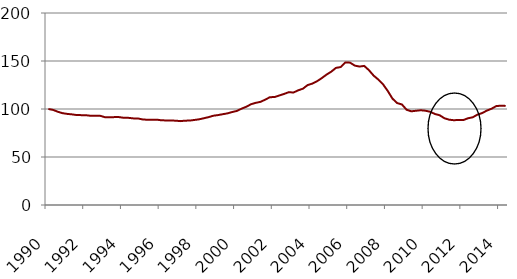
| Category | Housing Index Flow of Funds |
|---|---|
| 1990.0 | 100 |
| 1990.0 | 99.079 |
| 1990.0 | 97.135 |
| 1990.0 | 95.655 |
| 1991.0 | 94.904 |
| 1991.0 | 94.409 |
| 1991.0 | 93.71 |
| 1991.0 | 93.604 |
| 1992.0 | 93.492 |
| 1992.0 | 92.92 |
| 1992.0 | 92.848 |
| 1992.0 | 92.913 |
| 1993.0 | 91.468 |
| 1993.0 | 91.497 |
| 1993.0 | 91.539 |
| 1993.0 | 91.553 |
| 1994.0 | 90.851 |
| 1994.0 | 90.785 |
| 1994.0 | 90.23 |
| 1994.0 | 90.149 |
| 1995.0 | 89.131 |
| 1995.0 | 88.782 |
| 1995.0 | 88.79 |
| 1995.0 | 88.913 |
| 1996.0 | 88.205 |
| 1996.0 | 88.107 |
| 1996.0 | 87.953 |
| 1996.0 | 87.86 |
| 1997.0 | 87.368 |
| 1997.0 | 87.852 |
| 1997.0 | 87.946 |
| 1997.0 | 88.6 |
| 1998.0 | 89.267 |
| 1998.0 | 90.38 |
| 1998.0 | 91.549 |
| 1998.0 | 93.003 |
| 1999.0 | 93.666 |
| 1999.0 | 94.595 |
| 1999.0 | 95.448 |
| 1999.0 | 96.865 |
| 2000.0 | 98.004 |
| 2000.0 | 100.381 |
| 2000.0 | 102.35 |
| 2000.0 | 104.992 |
| 2001.0 | 106.434 |
| 2001.0 | 107.434 |
| 2001.0 | 109.754 |
| 2001.0 | 112.291 |
| 2002.0 | 112.478 |
| 2002.0 | 114.092 |
| 2002.0 | 115.686 |
| 2002.0 | 117.515 |
| 2003.0 | 117.176 |
| 2003.0 | 119.46 |
| 2003.0 | 121.152 |
| 2003.0 | 124.935 |
| 2004.0 | 126.469 |
| 2004.0 | 128.956 |
| 2004.0 | 132.178 |
| 2004.0 | 135.805 |
| 2005.0 | 138.861 |
| 2005.0 | 142.813 |
| 2005.0 | 143.685 |
| 2005.0 | 148.467 |
| 2006.0 | 148.284 |
| 2006.0 | 145.202 |
| 2006.0 | 144.214 |
| 2006.0 | 144.894 |
| 2007.0 | 140.44 |
| 2007.0 | 134.761 |
| 2007.0 | 130.645 |
| 2007.0 | 125.66 |
| 2008.0 | 118.729 |
| 2008.0 | 110.757 |
| 2008.0 | 106.166 |
| 2008.0 | 104.708 |
| 2009.0 | 99.196 |
| 2009.0 | 97.587 |
| 2009.0 | 98.173 |
| 2009.0 | 98.702 |
| 2010.0 | 98.213 |
| 2010.0 | 97.117 |
| 2010.0 | 94.815 |
| 2010.0 | 93.497 |
| 2011.0 | 90.403 |
| 2011.0 | 88.9 |
| 2011.0 | 88.303 |
| 2011.0 | 88.601 |
| 2012.0 | 88.436 |
| 2012.0 | 90.326 |
| 2012.0 | 91.309 |
| 2012.0 | 94.081 |
| 2013.0 | 95.724 |
| 2013.0 | 98.294 |
| 2013.0 | 100.259 |
| 2013.0 | 103 |
| 2014.0 | 103.492 |
| 2014.0 | 103.208 |